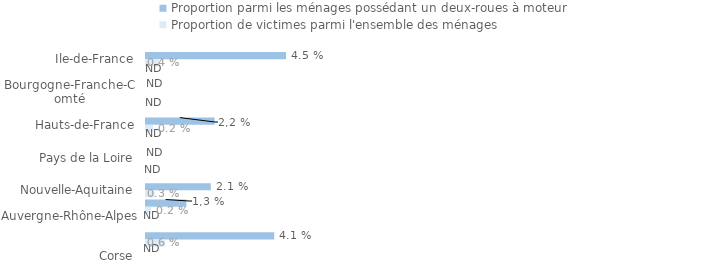
| Category | Proportion parmi les ménages possédant un deux-roues à moteur | Proportion de victimes parmi l'ensemble des ménages |
|---|---|---|
| Ile-de-France | 0.045 | 0.004 |
| Centre-Val de Loire | 0 | 0 |
| Bourgogne-Franche-Comté | 0 | 0 |
| Normandie | 0 | 0 |
| Hauts-de-France | 0.022 | 0.002 |
| Grand Est | 0 | 0 |
| Pays de la Loire | 0 | 0 |
| Bretagne | 0 | 0 |
| Nouvelle-Aquitaine | 0.021 | 0.003 |
| Occitanie | 0.013 | 0.002 |
| Auvergne-Rhône-Alpes | 0 | 0 |
| Provence-Alpes-Côte d’Azur | 0.041 | 0.006 |
| Corse | 0 | 0 |